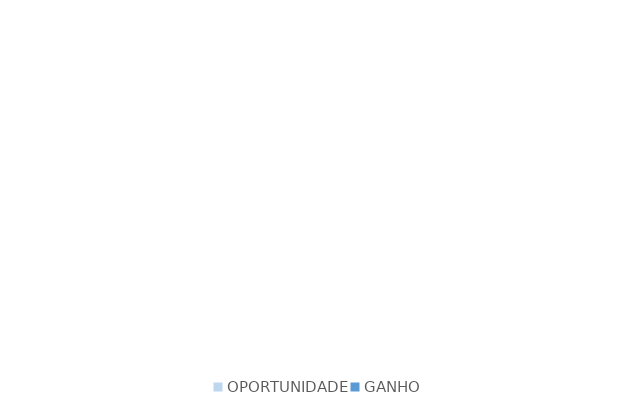
| Category | Series 0 |
|---|---|
| OPORTUNIDADE | 0 |
| GANHO | 0 |